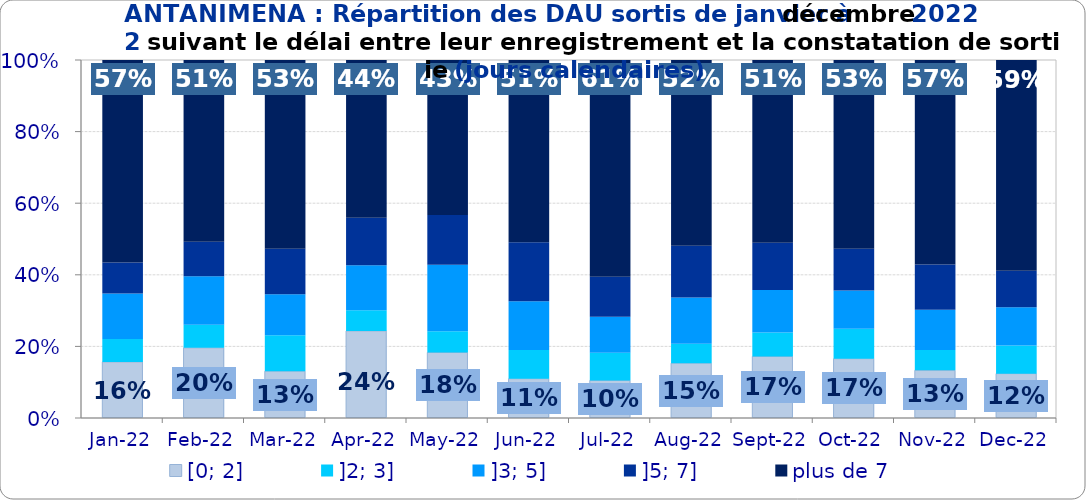
| Category | [0; 2] | ]2; 3] | ]3; 5] | ]5; 7] | plus de 7 |
|---|---|---|---|---|---|
| 2022-01-01 | 0.157 | 0.064 | 0.127 | 0.087 | 0.566 |
| 2022-02-01 | 0.196 | 0.065 | 0.136 | 0.096 | 0.508 |
| 2022-03-01 | 0.131 | 0.1 | 0.115 | 0.127 | 0.527 |
| 2022-04-01 | 0.243 | 0.058 | 0.126 | 0.133 | 0.441 |
| 2022-05-01 | 0.183 | 0.059 | 0.186 | 0.139 | 0.433 |
| 2022-06-01 | 0.11 | 0.08 | 0.136 | 0.165 | 0.509 |
| 2022-07-01 | 0.105 | 0.077 | 0.101 | 0.112 | 0.606 |
| 2022-08-01 | 0.153 | 0.054 | 0.13 | 0.145 | 0.519 |
| 2022-09-01 | 0.172 | 0.067 | 0.119 | 0.132 | 0.51 |
| 2022-10-01 | 0.166 | 0.083 | 0.107 | 0.116 | 0.527 |
| 2022-11-01 | 0.133 | 0.057 | 0.112 | 0.127 | 0.571 |
| 2022-12-01 | 0.124 | 0.078 | 0.107 | 0.102 | 0.589 |